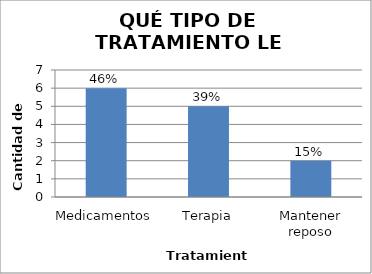
| Category | Series 0 |
|---|---|
| Medicamentos | 6 |
| Terapia | 5 |
| Mantener reposo | 2 |